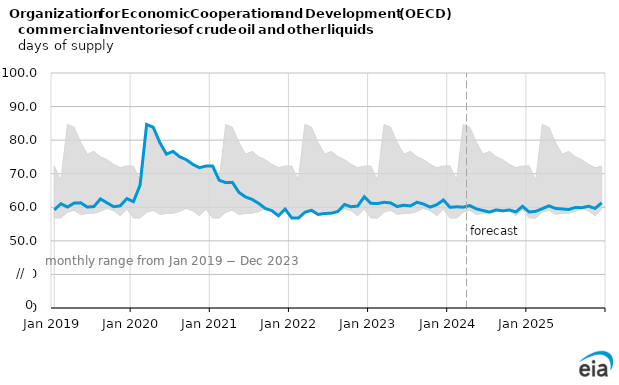
| Category | OECD commercial crude oil stocks |
|---|---|
| 2019-01-01 | 59.243 |
| 2019-02-01 | 61.038 |
| 2019-03-01 | 60.076 |
| 2019-04-01 | 61.235 |
| 2019-05-01 | 61.324 |
| 2019-06-01 | 60.081 |
| 2019-07-01 | 60.208 |
| 2019-08-01 | 62.483 |
| 2019-09-01 | 61.32 |
| 2019-10-01 | 60.177 |
| 2019-11-01 | 60.43 |
| 2019-12-01 | 62.594 |
| 2020-01-01 | 61.668 |
| 2020-02-01 | 66.554 |
| 2020-03-01 | 84.661 |
| 2020-04-01 | 83.847 |
| 2020-05-01 | 79.293 |
| 2020-06-01 | 75.83 |
| 2020-07-01 | 76.661 |
| 2020-08-01 | 75.047 |
| 2020-09-01 | 74.19 |
| 2020-10-01 | 72.783 |
| 2020-11-01 | 71.79 |
| 2020-12-01 | 72.299 |
| 2021-01-01 | 72.316 |
| 2021-02-01 | 68.065 |
| 2021-03-01 | 67.34 |
| 2021-04-01 | 67.421 |
| 2021-05-01 | 64.439 |
| 2021-06-01 | 63.069 |
| 2021-07-01 | 62.338 |
| 2021-08-01 | 61.148 |
| 2021-09-01 | 59.65 |
| 2021-10-01 | 58.979 |
| 2021-11-01 | 57.454 |
| 2021-12-01 | 59.451 |
| 2022-01-01 | 56.812 |
| 2022-02-01 | 56.772 |
| 2022-03-01 | 58.518 |
| 2022-04-01 | 59.116 |
| 2022-05-01 | 57.848 |
| 2022-06-01 | 58.157 |
| 2022-07-01 | 58.233 |
| 2022-08-01 | 58.75 |
| 2022-09-01 | 60.839 |
| 2022-10-01 | 60.167 |
| 2022-11-01 | 60.373 |
| 2022-12-01 | 63.106 |
| 2023-01-01 | 61.188 |
| 2023-02-01 | 61.104 |
| 2023-03-01 | 61.488 |
| 2023-04-01 | 61.295 |
| 2023-05-01 | 60.229 |
| 2023-06-01 | 60.618 |
| 2023-07-01 | 60.41 |
| 2023-08-01 | 61.512 |
| 2023-09-01 | 60.948 |
| 2023-10-01 | 60.057 |
| 2023-11-01 | 60.775 |
| 2023-12-01 | 62.163 |
| 2024-01-01 | 59.98 |
| 2024-02-01 | 60.148 |
| 2024-03-01 | 60.03 |
| 2024-04-01 | 60.515 |
| 2024-05-01 | 59.513 |
| 2024-06-01 | 59.039 |
| 2024-07-01 | 58.576 |
| 2024-08-01 | 59.217 |
| 2024-09-01 | 58.935 |
| 2024-10-01 | 59.195 |
| 2024-11-01 | 58.626 |
| 2024-12-01 | 60.285 |
| 2025-01-01 | 58.599 |
| 2025-02-01 | 58.806 |
| 2025-03-01 | 59.591 |
| 2025-04-01 | 60.434 |
| 2025-05-01 | 59.638 |
| 2025-06-01 | 59.503 |
| 2025-07-01 | 59.325 |
| 2025-08-01 | 59.959 |
| 2025-09-01 | 59.876 |
| 2025-10-01 | 60.307 |
| 2025-11-01 | 59.668 |
| 2025-12-01 | 61.327 |